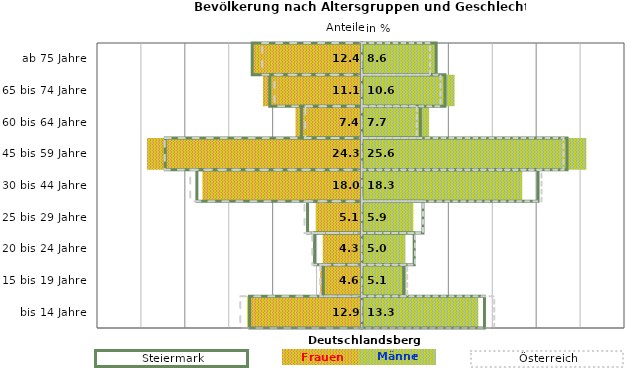
| Category | Frauen | Männer | Frauen Spalte2 | Männer Spalte2 | Frauen Spalte3 | Männer Spalte3 |
|---|---|---|---|---|---|---|
| bis 14 Jahre | -12.9 | 13.3 | 14 | -12.8 | -13.8 | 15.1 |
| 15 bis 19 Jahre | -4.6 | 5.1 | 4.8 | -4.4 | -4.7 | 5.2 |
| 20 bis 24 Jahre | -4.3 | 5 | 6 | -5.4 | -5.6 | 6.1 |
| 25 bis 29 Jahre | -5.1 | 5.9 | 7 | -6.2 | -6.5 | 7 |
| 30 bis 44 Jahre | -18 | 18.3 | 20.1 | -18.8 | -19.5 | 20.5 |
| 45 bis 59 Jahre | -24.3 | 25.6 | 23.4 | -22.4 | -22.4 | 23 |
| 60 bis 64 Jahre | -7.4 | 7.7 | 6.7 | -6.9 | -6.4 | 6.3 |
| 65 bis 74 Jahre | -11.1 | 10.6 | 9.5 | -10.5 | -9.9 | 9 |
| ab 75 Jahre | -12.4 | 8.6 | 8.5 | -12.5 | -11.3 | 7.8 |